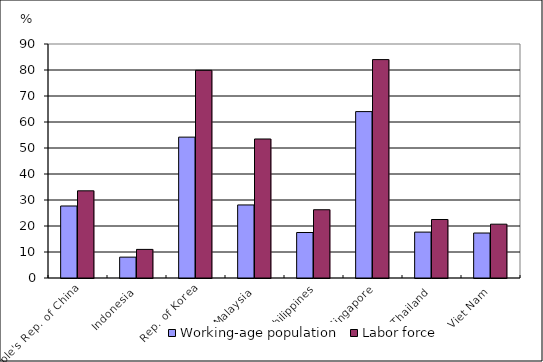
| Category | Working-age population | Labor force |
|---|---|---|
| People's Rep. of China | 27.697 | 33.532 |
| Indonesia | 8.027 | 11.003 |
| Rep. of Korea | 54.181 | 79.869 |
| Malaysia | 28.1 | 53.467 |
| Philippines | 17.5 | 26.253 |
| Singapore | 64 | 84 |
| Thailand | 17.652 | 22.5 |
| Viet Nam | 17.3 | 20.7 |